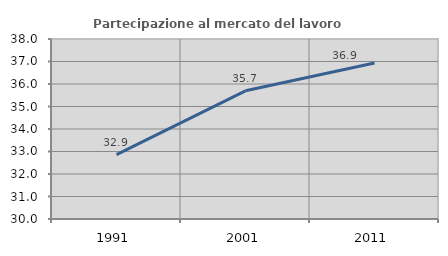
| Category | Partecipazione al mercato del lavoro  femminile |
|---|---|
| 1991.0 | 32.864 |
| 2001.0 | 35.698 |
| 2011.0 | 36.935 |